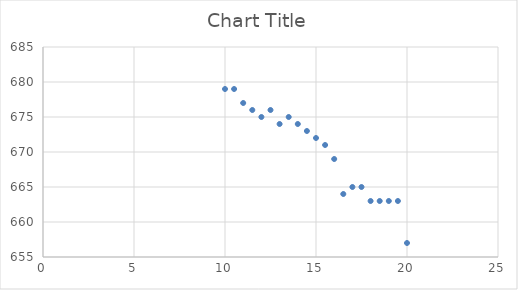
| Category | Series 0 |
|---|---|
| 20.0 | 657 |
| 19.5 | 663 |
| 19.0 | 663 |
| 18.5 | 663 |
| 18.0 | 663 |
| 17.5 | 665 |
| 17.0 | 665 |
| 16.5 | 664 |
| 16.0 | 669 |
| 15.5 | 671 |
| 15.0 | 672 |
| 14.5 | 673 |
| 14.0 | 674 |
| 13.5 | 675 |
| 13.0 | 674 |
| 12.5 | 676 |
| 12.0 | 675 |
| 11.5 | 676 |
| 11.0 | 677 |
| 10.5 | 679 |
| 10.0 | 679 |